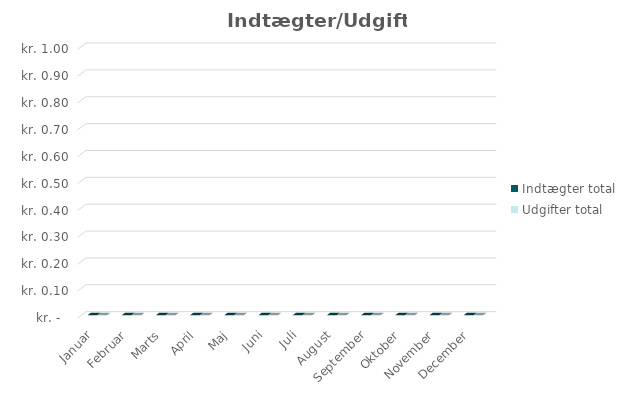
| Category | Indtægter total | Udgifter total |
|---|---|---|
| Januar | 0 | 0 |
| Februar | 0 | 0 |
| Marts | 0 | 0 |
| April | 0 | 0 |
| Maj | 0 | 0 |
| Juni | 0 | 0 |
| Juli | 0 | 0 |
| August | 0 | 0 |
| September | 0 | 0 |
| Oktober | 0 | 0 |
| November | 0 | 0 |
| December | 0 | 0 |